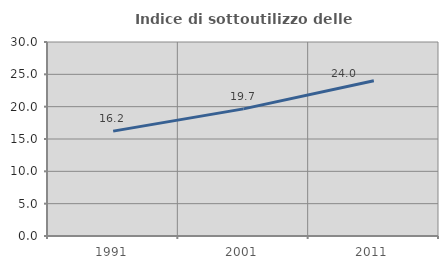
| Category | Indice di sottoutilizzo delle abitazioni  |
|---|---|
| 1991.0 | 16.216 |
| 2001.0 | 19.661 |
| 2011.0 | 23.998 |